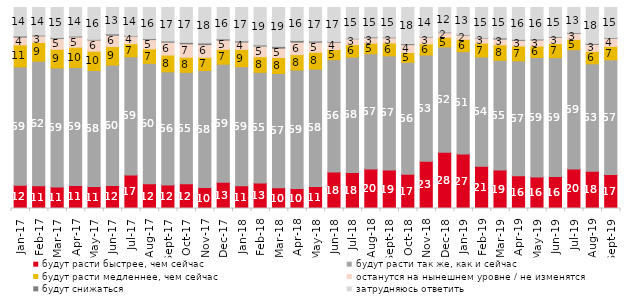
| Category | будут расти быстрее, чем сейчас | будут расти так же, как и сейчас | будут расти медленнее, чем сейчас | останутся на нынешнем уровне / не изменятся | будут снижаться | затрудняюсь ответить |
|---|---|---|---|---|---|---|
| 2017-01-01 | 11.6 | 58.85 | 10.95 | 3.85 | 0.6 | 14.15 |
| 2017-02-01 | 11.35 | 61.95 | 9.3 | 3.3 | 0.35 | 13.75 |
| 2017-03-01 | 10.7 | 59.25 | 9.25 | 5.35 | 0.45 | 15 |
| 2017-04-01 | 11.45 | 58.75 | 10.05 | 5.1 | 0.45 | 14.2 |
| 2017-05-01 | 11 | 57.65 | 9.6 | 5.55 | 0.35 | 15.85 |
| 2017-06-01 | 11.5 | 59.85 | 9.2 | 5.65 | 0.7 | 13.1 |
| 2017-07-01 | 16.7 | 58.8 | 6.5 | 3.75 | 0.25 | 14 |
| 2017-08-01 | 12.35 | 59.85 | 7.2 | 4.65 | 0.45 | 15.5 |
| 2017-09-01 | 11.75 | 56.25 | 8.35 | 6.4 | 0.6 | 16.65 |
| 2017-10-01 | 12.3 | 55.45 | 7.5 | 6.65 | 0.75 | 17.35 |
| 2017-11-01 | 10.4 | 58.25 | 6.55 | 6.35 | 0.8 | 17.65 |
| 2017-12-01 | 13.1 | 58.7 | 7.4 | 4.55 | 0.65 | 15.6 |
| 2018-01-01 | 11.35 | 59.2 | 8.6 | 3.65 | 0.6 | 16.6 |
| 2018-02-01 | 12.7 | 55.05 | 7.75 | 5.3 | 0.55 | 18.65 |
| 2018-03-01 | 10.3 | 56.85 | 8 | 4.6 | 0.9 | 19.35 |
| 2018-04-01 | 9.9 | 59 | 7.65 | 6.2 | 0.85 | 16.4 |
| 2018-05-01 | 10.95 | 58.4 | 8.4 | 4.95 | 0.65 | 16.65 |
| 2018-06-01 | 18.15 | 55.9 | 5.05 | 3.6 | 0.4 | 16.9 |
| 2018-07-01 | 17.85 | 57.5 | 6.15 | 2.95 | 0.2 | 15.35 |
| 2018-08-01 | 19.65 | 57.35 | 5.25 | 2.7 | 0.4 | 14.65 |
| 2018-09-01 | 19.1 | 56.85 | 6.4 | 2.6 | 0.3 | 14.75 |
| 2018-10-01 | 17.1 | 55.65 | 4.8 | 3.95 | 0.5 | 18 |
| 2018-11-01 | 23.453 | 52.894 | 5.539 | 3.443 | 0.2 | 14.471 |
| 2018-12-01 | 27.95 | 52.45 | 4.8 | 2.25 | 0.3 | 12.25 |
| 2019-01-01 | 27.15 | 50.9 | 6.1 | 2.15 | 0.3 | 13.4 |
| 2019-02-01 | 21.05 | 54.35 | 6.85 | 2.55 | 0.2 | 15 |
| 2019-03-01 | 19.095 | 54.649 | 7.708 | 2.834 | 0.597 | 15.117 |
| 2019-04-01 | 16.287 | 57.178 | 7.376 | 2.822 | 0.495 | 15.842 |
| 2019-05-01 | 15.701 | 59.435 | 5.646 | 3.071 | 0.446 | 15.701 |
| 2019-06-01 | 15.86 | 59.202 | 6.983 | 3.092 | 0.349 | 14.514 |
| 2019-07-01 | 19.604 | 59.406 | 5.099 | 2.921 | 0.396 | 12.574 |
| 2019-08-01 | 18.482 | 53.497 | 6.194 | 3.447 | 0.45 | 17.932 |
| 2019-09-01 | 16.881 | 57.079 | 6.683 | 4.01 | 0.297 | 15.05 |